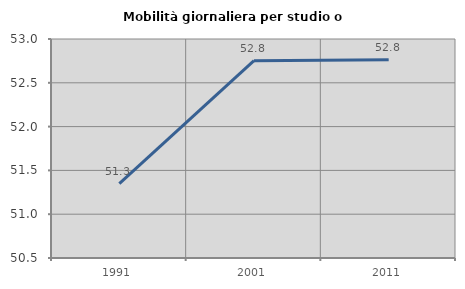
| Category | Mobilità giornaliera per studio o lavoro |
|---|---|
| 1991.0 | 51.348 |
| 2001.0 | 52.752 |
| 2011.0 | 52.764 |